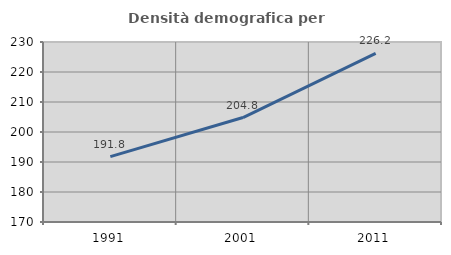
| Category | Densità demografica |
|---|---|
| 1991.0 | 191.81 |
| 2001.0 | 204.82 |
| 2011.0 | 226.238 |